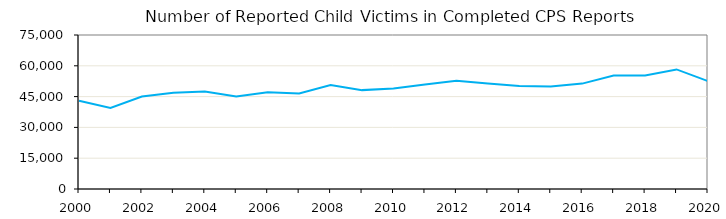
| Category | Number of Reported Child Victims |
|---|---|
| 2000.0 | 42993 |
| 2001.0 | 39507 |
| 2002.0 | 45077 |
| 2003.0 | 46818 |
| 2004.0 | 47445 |
| 2005.0 | 45078 |
| 2006.0 | 47130 |
| 2007.0 | 46511 |
| 2008.0 | 50598 |
| 2009.0 | 48155 |
| 2010.0 | 48915 |
| 2011.0 | 50887 |
| 2012.0 | 52675 |
| 2013.0 | 51346 |
| 2014.0 | 50136 |
| 2015.0 | 49868 |
| 2016.0 | 51327 |
| 2017.0 | 55258 |
| 2018.0 | 55255 |
| 2019.0 | 58234 |
| 2020.0 | 52554 |